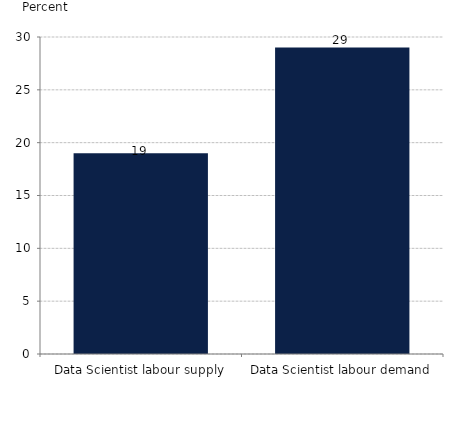
| Category | 2018-as éves változás |
|---|---|
| Data Scientist labour supply | 19 |
| Data Scientist labour demand | 29 |